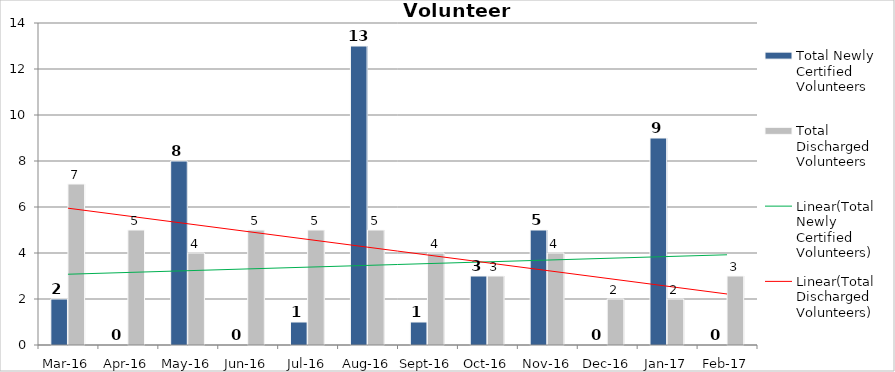
| Category | Total Newly Certified Volunteers | Total Discharged Volunteers |
|---|---|---|
| Mar-16 | 2 | 7 |
| Apr-16 | 0 | 5 |
| May-16 | 8 | 4 |
| Jun-16 | 0 | 5 |
| Jul-16 | 1 | 5 |
| Aug-16 | 13 | 5 |
| Sep-16 | 1 | 4 |
| Oct-16 | 3 | 3 |
| Nov-16 | 5 | 4 |
| Dec-16 | 0 | 2 |
| Jan-17 | 9 | 2 |
| Feb-17 | 0 | 3 |